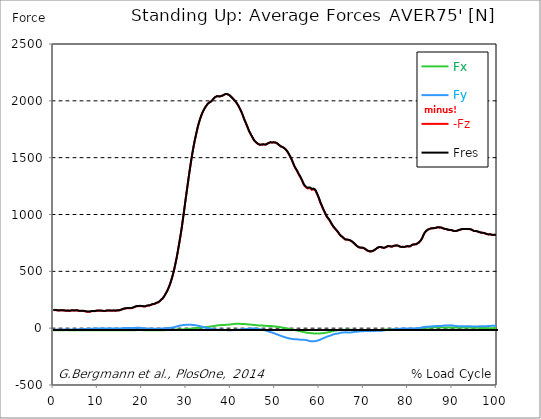
| Category |  Fx |  Fy |  -Fz |  Fres |
|---|---|---|---|---|
| 0.0 | -18.044 | -13.734 | 157.084 | 158.778 |
| 0.167348456675344 | -18.174 | -13.693 | 158.387 | 160.071 |
| 0.334696913350688 | -18.285 | -13.503 | 159.65 | 161.314 |
| 0.5020453700260321 | -18.235 | -13.092 | 159.028 | 160.662 |
| 0.669393826701376 | -18.174 | -12.891 | 158.156 | 159.77 |
| 0.83674228337672 | -18.024 | -12.631 | 157.444 | 159.028 |
| 1.0040907400520642 | -17.813 | -12.761 | 155.66 | 157.244 |
| 1.1621420602454444 | -17.813 | -13.222 | 155.049 | 156.683 |
| 1.3294905169207885 | -17.844 | -13.413 | 155.44 | 157.094 |
| 1.4968389735961325 | -17.864 | -13.473 | 156.011 | 157.665 |
| 1.6641874302714765 | -17.904 | -13.313 | 156.953 | 158.587 |
| 1.8315358869468206 | -17.844 | -12.861 | 157.394 | 158.978 |
| 1.9988843436221646 | -17.673 | -12.45 | 156.973 | 158.507 |
| 2.1662328002975086 | -17.513 | -12.33 | 156.432 | 157.946 |
| 2.333581256972853 | -17.423 | -12.4 | 155.319 | 156.843 |
| 2.5009297136481967 | -17.392 | -12.45 | 155.239 | 156.763 |
| 2.6682781703235405 | -17.232 | -11.889 | 154.457 | 155.921 |
| 2.8356266269988843 | -17.102 | -11.679 | 152.773 | 154.227 |
| 3.002975083674229 | -17.122 | -11.999 | 152.362 | 153.846 |
| 3.1703235403495724 | -17.292 | -12.11 | 153.204 | 154.708 |
| 3.337671997024917 | -17.402 | -11.759 | 153.755 | 155.229 |
| 3.4957233172182973 | -17.352 | -11.378 | 153.004 | 154.457 |
| 3.663071773893641 | -17.262 | -11.478 | 151.971 | 153.435 |
| 3.8304202305689854 | -17.513 | -11.929 | 153.014 | 154.527 |
| 3.997768687244329 | -17.743 | -12.21 | 154.788 | 156.322 |
| 4.165117143919673 | -17.864 | -11.849 | 156.111 | 157.625 |
| 4.332465600595017 | -17.864 | -11.338 | 156.462 | 157.936 |
| 4.499814057270361 | -17.824 | -11.237 | 155.48 | 156.943 |
| 4.667162513945706 | -17.844 | -11.378 | 154.267 | 155.77 |
| 4.834510970621049 | -18.014 | -11.458 | 154.888 | 156.422 |
| 5.001859427296393 | -18.114 | -11.428 | 155.901 | 157.434 |
| 5.169207883971737 | -18.164 | -10.947 | 156.693 | 158.196 |
| 5.336556340647081 | -17.964 | -10.065 | 155.841 | 157.274 |
| 5.503904797322425 | -17.864 | -10.004 | 154.257 | 155.69 |
| 5.671253253997769 | -17.944 | -9.603 | 153.034 | 154.467 |
| 5.82930457419115 | -17.944 | -9.634 | 151.059 | 152.512 |
| 5.996653030866494 | -17.944 | -9.704 | 150.838 | 152.302 |
| 6.164001487541838 | -18.014 | -9.593 | 150.999 | 152.482 |
| 6.331349944217181 | -18.164 | -9.433 | 151.41 | 152.903 |
| 6.498698400892526 | -18.345 | -9.062 | 151.801 | 153.304 |
| 6.66604685756787 | -18.656 | -8.711 | 151.831 | 153.354 |
| 6.833395314243213 | -18.916 | -8.17 | 151.309 | 152.843 |
| 7.000743770918558 | -18.936 | -7.548 | 149.906 | 151.42 |
| 7.168092227593902 | -18.926 | -7.067 | 148.563 | 150.066 |
| 7.335440684269246 | -18.796 | -6.947 | 146.808 | 148.302 |
| 7.50278914094459 | -18.676 | -6.696 | 145.606 | 147.089 |
| 7.6701375976199335 | -18.555 | -6.325 | 144.934 | 146.397 |
| 7.837486054295278 | -18.435 | -5.934 | 144.312 | 145.766 |
| 7.995537374488658 | -18.204 | -5.363 | 144.352 | 145.786 |
| 8.162885831164003 | -18.214 | -4.912 | 144.924 | 146.347 |
| 8.330234287839346 | -18.355 | -4.992 | 146.207 | 147.651 |
| 8.49758274451469 | -18.475 | -4.972 | 148.072 | 149.515 |
| 8.664931201190035 | -18.455 | -4.561 | 149.776 | 151.179 |
| 8.832279657865378 | -18.415 | -4.05 | 150.377 | 151.751 |
| 8.999628114540721 | -18.415 | -3.739 | 150.177 | 151.54 |
| 9.166976571216066 | -18.405 | -3.629 | 149.826 | 151.179 |
| 9.334325027891412 | -18.385 | -3.569 | 149.425 | 150.788 |
| 9.501673484566755 | -18.535 | -3.629 | 150.898 | 152.272 |
| 9.669021941242098 | -18.746 | -3.659 | 152.532 | 153.936 |
| 9.836370397917442 | -18.636 | -2.897 | 153.675 | 155.029 |
| 10.003718854592787 | -18.676 | -2.566 | 153.926 | 155.269 |
| 10.17106731126813 | -18.726 | -2.286 | 154.056 | 155.399 |
| 10.329118631461512 | -18.686 | -2.426 | 153.234 | 154.577 |
| 10.496467088136853 | -18.605 | -2.426 | 153.755 | 155.089 |
| 10.663815544812199 | -18.515 | -2.346 | 154.146 | 155.46 |
| 10.831164001487544 | -18.425 | -2.055 | 153.996 | 155.299 |
| 10.998512458162887 | -18.355 | -1.895 | 152.713 | 154.016 |
| 11.16586091483823 | -18.275 | -1.895 | 151.299 | 152.593 |
| 11.333209371513574 | -18.295 | -2.005 | 150.507 | 151.811 |
| 11.50055782818892 | -18.375 | -2.296 | 150.177 | 151.49 |
| 11.667906284864264 | -18.425 | -2.486 | 150.778 | 152.081 |
| 11.835254741539607 | -18.375 | -2.506 | 152.382 | 153.655 |
| 12.00260319821495 | -18.295 | -2.436 | 153.826 | 155.079 |
| 12.169951654890292 | -18.174 | -2.055 | 154.377 | 155.6 |
| 12.337300111565641 | -18.255 | -2.436 | 154.688 | 155.921 |
| 12.504648568240984 | -18.275 | -2.667 | 155.199 | 156.432 |
| 12.662699888434362 | -18.174 | -2.496 | 155.49 | 156.703 |
| 12.830048345109708 | -18.054 | -2.185 | 154.257 | 155.45 |
| 12.997396801785053 | -18.034 | -2.366 | 153.124 | 154.327 |
| 13.164745258460396 | -18.174 | -2.887 | 152.793 | 154.016 |
| 13.33209371513574 | -18.275 | -2.877 | 153.806 | 155.039 |
| 13.499442171811083 | -18.455 | -2.767 | 155.259 | 156.502 |
| 13.666790628486426 | -18.545 | -2.546 | 155.259 | 156.512 |
| 13.834139085161771 | -18.455 | -2.075 | 154.036 | 155.279 |
| 14.001487541837117 | -18.565 | -2.205 | 152.943 | 154.207 |
| 14.16883599851246 | -18.575 | -2.506 | 153.755 | 155.019 |
| 14.336184455187803 | -18.505 | -2.596 | 155.389 | 156.642 |
| 14.503532911863147 | -18.355 | -2.416 | 155.8 | 157.033 |
| 14.670881368538492 | -18.275 | -2.436 | 155.339 | 156.582 |
| 14.828932688731873 | -18.285 | -2.636 | 155.891 | 157.154 |
| 14.996281145407215 | -18.285 | -2.787 | 157.765 | 159.048 |
| 15.163629602082558 | -18.134 | -2.356 | 160.141 | 161.434 |
| 15.330978058757903 | -17.964 | -1.744 | 162.577 | 163.9 |
| 15.498326515433247 | -17.894 | -1.103 | 165.504 | 166.877 |
| 15.665674972108594 | -17.793 | -0.16 | 167.94 | 169.414 |
| 15.833023428783937 | -17.813 | 0.361 | 169.394 | 170.927 |
| 16.00037188545928 | -17.984 | 0.381 | 171.048 | 172.632 |
| 16.167720342134626 | -18.084 | 0.732 | 172.752 | 174.356 |
| 16.335068798809967 | -18.134 | 1.093 | 173.985 | 175.609 |
| 16.502417255485312 | -18.134 | 1.444 | 174.777 | 176.431 |
| 16.669765712160658 | -18.134 | 1.834 | 175.238 | 176.922 |
| 16.837114168836 | -18.194 | 1.764 | 174.817 | 176.521 |
| 17.004462625511344 | -18.295 | 1.454 | 174.997 | 176.722 |
| 17.16251394570472 | -18.164 | 1.614 | 176.511 | 178.255 |
| 17.32986240238007 | -18.084 | 2.005 | 176.311 | 178.085 |
| 17.497210859055414 | -18.194 | 1.714 | 175.669 | 177.483 |
| 17.664559315730756 | -18.445 | 1.233 | 176.22 | 178.075 |
| 17.8319077724061 | -18.605 | 0.992 | 178.105 | 180.02 |
| 17.999256229081443 | -18.706 | 0.982 | 180.651 | 182.596 |
| 18.166604685756788 | -18.776 | 1.043 | 183.007 | 185.032 |
| 18.333953142432133 | -18.565 | 1.764 | 185.523 | 187.698 |
| 18.501301599107478 | -18.054 | 2.737 | 188.33 | 190.625 |
| 18.668650055782823 | -17.342 | 3.468 | 191.167 | 193.523 |
| 18.835998512458165 | -16.731 | 3.709 | 192.31 | 194.665 |
| 19.00334696913351 | -16.069 | 3.809 | 193.462 | 195.808 |
| 19.170695425808855 | -15.829 | 3.719 | 194.234 | 196.52 |
| 19.338043882484197 | -16.109 | 3.057 | 193.813 | 196.039 |
| 19.496095202677576 | -16.27 | 2.747 | 194.375 | 196.58 |
| 19.66344365935292 | -16.42 | 2.326 | 194.074 | 196.229 |
| 19.830792116028263 | -16.701 | 1.213 | 192.811 | 194.826 |
| 19.998140572703612 | -16.981 | 0.702 | 193.182 | 195.187 |
| 20.165489029378953 | -17.282 | 0.11 | 192.47 | 194.425 |
| 20.3328374860543 | -17.583 | -0.922 | 191.177 | 193.021 |
| 20.500185942729644 | -17.713 | -1.804 | 189.874 | 191.648 |
| 20.667534399404985 | -17.773 | -2.516 | 190.395 | 192.159 |
| 20.83488285608033 | -18.074 | -3.198 | 192.69 | 194.515 |
| 21.002231312755672 | -18.235 | -3.188 | 195.537 | 197.362 |
| 21.16957976943102 | -18.265 | -2.987 | 197.302 | 199.096 |
| 21.336928226106362 | -18.375 | -3.168 | 198.425 | 200.239 |
| 21.504276682781704 | -18.395 | -3.378 | 199.056 | 200.88 |
| 21.67162513945705 | -18.315 | -3.629 | 199.166 | 201.011 |
| 21.82967645965043 | -18.435 | -4.321 | 200.63 | 202.514 |
| 21.997024916325774 | -18.605 | -4.772 | 203.507 | 205.412 |
| 22.16437337300112 | -18.666 | -4.752 | 207.186 | 209.06 |
| 22.33172182967646 | -18.676 | -4.471 | 209.632 | 211.476 |
| 22.499070286351806 | -18.565 | -4.441 | 210.133 | 211.968 |
| 22.666418743027148 | -18.545 | -4.792 | 211.296 | 213.14 |
| 22.833767199702496 | -18.716 | -4.922 | 213.702 | 215.536 |
| 23.00111565637784 | -18.876 | -5.183 | 216.318 | 218.163 |
| 23.168464113053183 | -18.976 | -5.263 | 219.877 | 221.721 |
| 23.335812569728528 | -19.057 | -4.942 | 222.944 | 224.759 |
| 23.50316102640387 | -19.016 | -4.712 | 225.019 | 226.804 |
| 23.670509483079215 | -18.916 | -4.501 | 226.944 | 228.698 |
| 23.83785793975456 | -18.996 | -4.631 | 230.393 | 232.147 |
| 23.995909259947936 | -18.956 | -4.551 | 236.588 | 238.292 |
| 24.163257716623285 | -18.836 | -4.01 | 243.344 | 244.978 |
| 24.330606173298627 | -18.475 | -3.158 | 249.9 | 251.444 |
| 24.49795462997397 | -18.164 | -2.717 | 255.765 | 257.228 |
| 24.665303086649313 | -17.874 | -2.326 | 261.559 | 262.942 |
| 24.83265154332466 | -17.773 | -2.135 | 269.678 | 271.022 |
| 25.0 | -17.553 | -2.045 | 279.573 | 280.866 |
| 25.167348456675345 | -17.312 | -1.564 | 291.061 | 292.294 |
| 25.334696913350694 | -16.971 | -1.012 | 302.799 | 303.922 |
| 25.502045370026035 | -16.52 | -0.07 | 314.097 | 315.119 |
| 25.669393826701377 | -16.18 | 0.852 | 325.364 | 326.307 |
| 25.836742283376722 | -16.26 | 1.444 | 339.519 | 340.411 |
| 26.004090740052067 | -16.38 | 2.075 | 355.007 | 355.859 |
| 26.17143919672741 | -16.58 | 2.356 | 371.477 | 372.289 |
| 26.329490516920792 | -16.691 | 2.406 | 388.769 | 389.531 |
| 26.49683897359613 | -16.41 | 3.118 | 408.818 | 409.55 |
| 26.66418743027148 | -15.969 | 4.361 | 430.05 | 430.752 |
| 26.831535886946828 | -15.408 | 5.333 | 452.555 | 453.257 |
| 26.998884343622166 | -14.676 | 6.827 | 476.654 | 477.346 |
| 27.166232800297514 | -13.894 | 8.33 | 502.317 | 503.018 |
| 27.333581256972852 | -13.282 | 9.623 | 529.914 | 530.616 |
| 27.5009297136482 | -12.641 | 11.488 | 560.068 | 560.799 |
| 27.668278170323543 | -12.12 | 13.503 | 591.063 | 591.855 |
| 27.835626626998888 | -11.668 | 15.227 | 623.342 | 624.154 |
| 28.002975083674233 | -11.338 | 16.871 | 658.237 | 659.069 |
| 28.170323540349575 | -11.217 | 18.746 | 694.847 | 695.719 |
| 28.33767199702492 | -11.117 | 20.42 | 733.421 | 734.313 |
| 28.50502045370026 | -11.097 | 21.964 | 772.165 | 773.078 |
| 28.663071773893645 | -11.288 | 23.397 | 810.319 | 811.241 |
| 28.830420230568986 | -11.658 | 24.44 | 850.597 | 851.499 |
| 28.99776868724433 | -11.769 | 25.482 | 893.782 | 894.675 |
| 29.165117143919673 | -11.077 | 26.725 | 940.747 | 941.629 |
| 29.33246560059502 | -10.696 | 27.467 | 988.474 | 989.316 |
| 29.499814057270367 | -10.385 | 28.219 | 1035.318 | 1036.14 |
| 29.66716251394571 | -9.804 | 28.82 | 1083.456 | 1084.257 |
| 29.834510970621054 | -9.202 | 29.502 | 1133.247 | 1134.029 |
| 30.00185942729639 | -8.882 | 29.913 | 1178.668 | 1179.43 |
| 30.169207883971744 | -8.1 | 30.274 | 1224.991 | 1225.733 |
| 30.33655634064708 | -7.137 | 30.535 | 1271.956 | 1272.668 |
| 30.50390479732243 | -6.335 | 30.525 | 1318.78 | 1319.462 |
| 30.671253253997772 | -5.674 | 30.414 | 1364.642 | 1365.294 |
| 30.829304574191156 | -5.112 | 29.933 | 1408.64 | 1409.251 |
| 30.996653030866494 | -4.591 | 29.271 | 1452.015 | 1452.607 |
| 31.164001487541842 | -4 | 28.941 | 1492.975 | 1493.557 |
| 31.331349944217187 | -3.258 | 28.63 | 1531.961 | 1532.522 |
| 31.498698400892525 | -2.406 | 27.988 | 1569.813 | 1570.374 |
| 31.666046857567874 | -1.494 | 27.206 | 1605.671 | 1606.222 |
| 31.833395314243212 | -0.622 | 26.595 | 1638.681 | 1639.223 |
| 32.00074377091856 | 0.19 | 26.164 | 1669.647 | 1670.188 |
| 32.1680922275939 | 0.952 | 25.522 | 1699.279 | 1699.81 |
| 32.33544068426925 | 1.664 | 23.868 | 1728.711 | 1729.222 |
| 32.50278914094459 | 2.366 | 22.294 | 1756.709 | 1757.211 |
| 32.670137597619934 | 3.067 | 21.001 | 1782.623 | 1783.104 |
| 32.83748605429528 | 3.789 | 19.708 | 1806.431 | 1806.902 |
| 33.004834510970625 | 4.561 | 18.505 | 1827.943 | 1828.394 |
| 33.162885831164004 | 5.213 | 17.002 | 1847.832 | 1848.283 |
| 33.33023428783935 | 5.694 | 15.127 | 1866.367 | 1866.798 |
| 33.497582744514695 | 6.245 | 13.272 | 1883.549 | 1883.95 |
| 33.664931201190036 | 7.087 | 11.548 | 1898.927 | 1899.318 |
| 33.83227965786538 | 7.809 | 9.804 | 1912.811 | 1913.181 |
| 33.99962811454073 | 8.32 | 8.04 | 1925.111 | 1925.461 |
| 34.16697657121607 | 8.952 | 6.566 | 1936.047 | 1936.378 |
| 34.33432502789141 | 9.433 | 4.852 | 1946.563 | 1946.884 |
| 34.50167348456676 | 10.245 | 3.398 | 1955.826 | 1956.146 |
| 34.6690219412421 | 11.147 | 1.865 | 1965.158 | 1965.479 |
| 34.83637039791744 | 12.039 | 0.331 | 1974.491 | 1974.802 |
| 35.00371885459279 | 12.721 | -1.193 | 1980.987 | 1981.298 |
| 35.17106731126814 | 13.433 | -2.225 | 1984.776 | 1985.087 |
| 35.338415767943474 | 13.724 | -2.877 | 1986.42 | 1986.721 |
| 35.49646708813686 | 14.295 | -4.27 | 1991.824 | 1992.104 |
| 35.6638155448122 | 15.137 | -5.544 | 1998.129 | 1998.4 |
| 35.831164001487544 | 16.23 | -6.626 | 2005.176 | 2005.447 |
| 35.998512458162885 | 17.062 | -8.01 | 2012.434 | 2012.704 |
| 36.165860914838234 | 18.144 | -9.553 | 2019.922 | 2020.193 |
| 36.333209371513576 | 19.628 | -10.536 | 2026.488 | 2026.759 |
| 36.50055782818892 | 20.871 | -11.699 | 2032.052 | 2032.342 |
| 36.667906284864266 | 21.813 | -12.711 | 2036.162 | 2036.473 |
| 36.83525474153961 | 22.956 | -13.543 | 2039.42 | 2039.741 |
| 37.002603198214956 | 23.989 | -14.114 | 2041.014 | 2041.354 |
| 37.1699516548903 | 24.921 | -13.904 | 2040.563 | 2040.913 |
| 37.337300111565646 | 25.582 | -13.693 | 2039.269 | 2039.63 |
| 37.50464856824098 | 25.853 | -13.713 | 2038.387 | 2038.748 |
| 37.66269988843437 | 26.735 | -13.533 | 2039.991 | 2040.372 |
| 37.83004834510971 | 27.216 | -13.633 | 2041.806 | 2042.197 |
| 37.99739680178505 | 27.798 | -13.734 | 2043.59 | 2043.991 |
| 38.16474525846039 | 28.439 | -13.673 | 2045.916 | 2046.317 |
| 38.33209371513574 | 28.53 | -13.974 | 2049.745 | 2050.146 |
| 38.49944217181109 | 28.52 | -14.766 | 2053.805 | 2054.206 |
| 38.666790628486424 | 28.51 | -15.769 | 2057.444 | 2057.845 |
| 38.83413908516178 | 28.881 | -16.37 | 2059.038 | 2059.439 |
| 39.001487541837115 | 30.013 | -16.39 | 2059.589 | 2060.01 |
| 39.16883599851246 | 30.414 | -17.002 | 2059.328 | 2059.749 |
| 39.336184455187805 | 30.775 | -17.763 | 2057.564 | 2057.995 |
| 39.503532911863154 | 31.437 | -18.004 | 2054.446 | 2054.877 |
| 39.670881368538495 | 31.788 | -18.315 | 2050.407 | 2050.838 |
| 39.83822982521384 | 32.169 | -18.636 | 2045.705 | 2046.146 |
| 39.996281145407224 | 33.131 | -18.465 | 2039.48 | 2039.931 |
| 40.163629602082565 | 33.983 | -18.315 | 2033.195 | 2033.656 |
| 40.33097805875791 | 34.685 | -18.064 | 2026.689 | 2027.16 |
| 40.498326515433256 | 35.998 | -17.012 | 2019.631 | 2020.133 |
| 40.6656749721086 | 36.89 | -16.099 | 2012.664 | 2013.176 |
| 40.83302342878393 | 37.512 | -15.448 | 2005.788 | 2006.309 |
| 41.00037188545929 | 37.993 | -14.936 | 1998.961 | 1999.492 |
| 41.16772034213463 | 38.213 | -14.185 | 1990.941 | 1991.493 |
| 41.33506879880997 | 38.324 | -14.084 | 1981.418 | 1981.979 |
| 41.50241725548531 | 38.163 | -14.215 | 1971.384 | 1971.945 |
| 41.66976571216066 | 38.263 | -13.282 | 1961.159 | 1961.73 |
| 41.837114168836 | 38.213 | -12.691 | 1949.57 | 1950.152 |
| 42.004462625511344 | 38.193 | -11.959 | 1936.789 | 1937.371 |
| 42.17181108218669 | 37.893 | -11.739 | 1924.018 | 1924.619 |
| 42.32986240238007 | 37.592 | -11.298 | 1910.455 | 1911.066 |
| 42.497210859055414 | 37.391 | -10.556 | 1895.548 | 1896.17 |
| 42.66455931573076 | 37.261 | -9.253 | 1879.188 | 1879.81 |
| 42.831907772406105 | 37.071 | -7.839 | 1861.205 | 1861.826 |
| 42.999256229081446 | 36.81 | -6.746 | 1843.501 | 1844.123 |
| 43.16660468575679 | 36.309 | -6.626 | 1828.134 | 1828.785 |
| 43.33395314243214 | 35.597 | -6.947 | 1813.017 | 1813.679 |
| 43.50130159910748 | 34.755 | -7.538 | 1797.329 | 1798.01 |
| 43.66865005578282 | 34.093 | -7.178 | 1781.63 | 1782.322 |
| 43.83599851245817 | 33.331 | -6.797 | 1765.872 | 1766.553 |
| 44.00334696913351 | 32.87 | -6.245 | 1748.088 | 1748.76 |
| 44.17069542580886 | 32.369 | -5.483 | 1733.002 | 1733.683 |
| 44.3380438824842 | 31.878 | -4.601 | 1720.14 | 1720.812 |
| 44.49609520267758 | 31.397 | -4.2 | 1708.101 | 1708.792 |
| 44.66344365935292 | 30.946 | -3.529 | 1695.951 | 1696.633 |
| 44.83079211602827 | 30.364 | -2.656 | 1684.062 | 1684.754 |
| 44.99814057270361 | 29.582 | -2.256 | 1672.323 | 1672.995 |
| 45.16548902937895 | 28.68 | -2.286 | 1660.013 | 1660.675 |
| 45.332837486054295 | 27.958 | -2.967 | 1650.58 | 1651.252 |
| 45.500185942729644 | 27.397 | -3.448 | 1644.375 | 1645.037 |
| 45.66753439940499 | 26.705 | -4.391 | 1637.468 | 1638.12 |
| 45.83488285608033 | 26.014 | -5.353 | 1630.752 | 1631.393 |
| 46.00223131275568 | 25.362 | -6.506 | 1625.669 | 1626.311 |
| 46.16957976943102 | 24.66 | -7.568 | 1620.036 | 1620.677 |
| 46.336928226106366 | 24.259 | -8.501 | 1617.159 | 1617.81 |
| 46.50427668278171 | 23.898 | -9.263 | 1614.863 | 1615.515 |
| 46.671625139457056 | 23.527 | -10.125 | 1613.089 | 1613.74 |
| 46.829676459650436 | 23.397 | -11.047 | 1613.77 | 1614.422 |
| 46.99702491632577 | 23.217 | -12.13 | 1615.114 | 1615.755 |
| 47.16437337300112 | 22.946 | -13.443 | 1616.808 | 1617.449 |
| 47.33172182967646 | 22.485 | -14.916 | 1617.129 | 1617.76 |
| 47.49907028635181 | 22.004 | -16.41 | 1616.617 | 1617.259 |
| 47.66641874302716 | 21.292 | -17.984 | 1614.743 | 1615.394 |
| 47.83376719970249 | 20.52 | -19.728 | 1613.51 | 1614.161 |
| 48.001115656377834 | 20.179 | -21.833 | 1616.277 | 1616.938 |
| 48.16846411305319 | 20.099 | -24.089 | 1620.356 | 1621.038 |
| 48.33581256972853 | 19.969 | -26.334 | 1624.236 | 1624.928 |
| 48.50316102640387 | 19.768 | -28.58 | 1627.765 | 1628.486 |
| 48.67050948307921 | 19.498 | -30.625 | 1630.632 | 1631.373 |
| 48.837857939754564 | 19.157 | -32.469 | 1632.837 | 1633.589 |
| 49.005206396429905 | 18.836 | -34.364 | 1634.862 | 1635.614 |
| 49.163257716623285 | 18.505 | -36.439 | 1635.062 | 1635.844 |
| 49.33060617329863 | 17.844 | -38.404 | 1633.017 | 1633.819 |
| 49.49795462997397 | 17.212 | -40.679 | 1633.689 | 1634.521 |
| 49.66530308664932 | 16.51 | -42.945 | 1634.581 | 1635.433 |
| 49.832651543324666 | 15.648 | -45.611 | 1633.92 | 1634.802 |
| 50.0 | 14.766 | -48.358 | 1632.997 | 1633.93 |
| 50.16734845667534 | 14.054 | -50.894 | 1631.674 | 1632.657 |
| 50.33469691335069 | 13.493 | -53.21 | 1629.118 | 1630.16 |
| 50.50204537002604 | 12.741 | -55.175 | 1623.645 | 1624.747 |
| 50.66939382670139 | 11.859 | -57.51 | 1618.562 | 1619.725 |
| 50.836742283376715 | 10.887 | -59.936 | 1613.379 | 1614.612 |
| 51.00409074005207 | 9.694 | -62.623 | 1607.936 | 1609.259 |
| 51.17143919672741 | 8.441 | -65.149 | 1602.854 | 1604.267 |
| 51.32949051692079 | 7.178 | -67.555 | 1598.263 | 1599.766 |
| 51.496838973596134 | 6.115 | -69.991 | 1596.428 | 1598.032 |
| 51.66418743027148 | 5.213 | -72.266 | 1592.93 | 1594.644 |
| 51.831535886946824 | 4.19 | -74.472 | 1588.84 | 1590.674 |
| 51.99888434362217 | 3.408 | -76.777 | 1584.84 | 1586.774 |
| 52.16623280029752 | 2.506 | -79.013 | 1579.797 | 1581.852 |
| 52.33358125697285 | 1.373 | -81.178 | 1574.144 | 1576.319 |
| 52.5009297136482 | 0.08 | -83.053 | 1566.946 | 1569.242 |
| 52.668278170323546 | -1.203 | -84.737 | 1559.077 | 1561.483 |
| 52.835626626998895 | -2.406 | -86.211 | 1550.085 | 1552.581 |
| 53.00297508367424 | -3.719 | -87.744 | 1538.988 | 1541.594 |
| 53.17032354034958 | -4.972 | -89.258 | 1527.4 | 1530.126 |
| 53.33767199702492 | -6.155 | -90.792 | 1515.811 | 1518.658 |
| 53.50502045370027 | -7.398 | -92.255 | 1503.411 | 1506.368 |
| 53.663071773893655 | -8.711 | -93.578 | 1489.707 | 1492.765 |
| 53.83042023056899 | -10.195 | -94.791 | 1474.851 | 1478.029 |
| 53.99776868724433 | -11.779 | -95.754 | 1459.414 | 1462.712 |
| 54.16511714391967 | -13.413 | -96.395 | 1443.234 | 1446.622 |
| 54.33246560059503 | -15.167 | -96.706 | 1426.734 | 1430.192 |
| 54.49981405727037 | -16.781 | -97.237 | 1413.321 | 1416.86 |
| 54.667162513945705 | -18.375 | -98.009 | 1402.575 | 1406.214 |
| 54.834510970621054 | -19.798 | -98.21 | 1392.26 | 1395.949 |
| 55.0018594272964 | -21.382 | -98.33 | 1381.313 | 1385.082 |
| 55.169207883971744 | -22.896 | -98.761 | 1367.479 | 1371.348 |
| 55.336556340647086 | -24.319 | -99.383 | 1353.745 | 1357.725 |
| 55.50390479732243 | -25.793 | -100.425 | 1343.099 | 1347.2 |
| 55.671253253997776 | -27.267 | -101.267 | 1331.852 | 1336.062 |
| 55.83860171067312 | -28.77 | -101.287 | 1318.219 | 1322.499 |
| 55.9966530308665 | -30.254 | -102.029 | 1306.42 | 1310.831 |
| 56.16400148754184 | -31.878 | -102.781 | 1292.356 | 1296.897 |
| 56.33134994421718 | -33.311 | -102.931 | 1277.118 | 1281.76 |
| 56.498698400892536 | -34.494 | -102.951 | 1262.954 | 1267.665 |
| 56.66604685756788 | -35.707 | -103.032 | 1252.328 | 1257.12 |
| 56.83339531424321 | -37 | -103.573 | 1244.749 | 1249.661 |
| 57.00074377091856 | -38.414 | -104.956 | 1238.825 | 1243.927 |
| 57.16809222759391 | -39.677 | -106.28 | 1233.281 | 1238.584 |
| 57.33544068426925 | -40.569 | -107.683 | 1229.332 | 1234.845 |
| 57.5027891409446 | -41.301 | -109.618 | 1229.201 | 1234.965 |
| 57.670137597619934 | -41.952 | -111.803 | 1232.169 | 1238.193 |
| 57.83748605429528 | -42.634 | -113.728 | 1234.705 | 1240.96 |
| 58.004834510970625 | -43.446 | -114.259 | 1229.602 | 1235.988 |
| 58.16288583116401 | -44.128 | -115.011 | 1225.603 | 1232.149 |
| 58.330234287839346 | -44.609 | -114.379 | 1217.292 | 1223.868 |
| 58.497582744514695 | -45.291 | -114.961 | 1222.134 | 1228.78 |
| 58.66493120119004 | -46.123 | -115.472 | 1221.493 | 1228.209 |
| 58.832279657865385 | -46.654 | -115.703 | 1220.811 | 1227.577 |
| 58.999628114540734 | -46.534 | -114.891 | 1214.846 | 1221.563 |
| 59.16697657121607 | -46.363 | -113.658 | 1205.925 | 1212.561 |
| 59.33432502789142 | -46.544 | -112.154 | 1192.482 | 1199.028 |
| 59.50167348456676 | -46.654 | -110.49 | 1177.866 | 1184.332 |
| 59.66902194124211 | -46.895 | -108.645 | 1162.739 | 1169.115 |
| 59.83637039791745 | -47.285 | -107.061 | 1147.291 | 1153.597 |
| 60.00371885459278 | -46.874 | -104.385 | 1129.608 | 1135.713 |
| 60.17106731126813 | -45.912 | -100.906 | 1110.091 | 1115.875 |
| 60.33841576794349 | -45.682 | -98.11 | 1093.951 | 1099.515 |
| 60.49646708813685 | -45.311 | -95.513 | 1079.827 | 1085.2 |
| 60.6638155448122 | -44.639 | -92.696 | 1064.249 | 1069.401 |
| 60.831164001487544 | -43.807 | -89.839 | 1048.871 | 1053.803 |
| 60.99851245816289 | -43.286 | -87.293 | 1035.218 | 1039.969 |
| 61.16586091483824 | -42.624 | -84.617 | 1022.056 | 1026.597 |
| 61.333209371513576 | -41.461 | -81.539 | 1008.322 | 1012.613 |
| 61.50055782818892 | -40.138 | -78.411 | 994.699 | 998.739 |
| 61.667906284864266 | -38.795 | -75.444 | 981.527 | 985.336 |
| 61.835254741539615 | -37.311 | -73.219 | 971.602 | 975.221 |
| 62.002603198214956 | -35.737 | -71.575 | 964.224 | 967.693 |
| 62.16995165489029 | -34.153 | -69.841 | 956.415 | 959.733 |
| 62.33730011156564 | -32.529 | -67.615 | 946.12 | 949.258 |
| 62.504648568240995 | -30.966 | -65.47 | 935.073 | 938.05 |
| 62.67199702491633 | -29.412 | -62.603 | 923.435 | 926.212 |
| 62.83004834510971 | -27.898 | -59.776 | 912.779 | 915.345 |
| 62.99739680178505 | -26.234 | -57.099 | 902.664 | 905.05 |
| 63.1647452584604 | -24.7 | -54.373 | 892.65 | 894.845 |
| 63.33209371513575 | -23.357 | -52.478 | 884.109 | 886.184 |
| 63.4994421718111 | -22.214 | -51.145 | 876.871 | 878.866 |
| 63.666790628486424 | -21.091 | -49.832 | 869.613 | 871.528 |
| 63.83413908516177 | -20.149 | -48.939 | 862.045 | 863.909 |
| 64.00148754183712 | -19.207 | -48.047 | 854.476 | 856.301 |
| 64.16883599851248 | -18.395 | -47.366 | 846.697 | 848.492 |
| 64.3361844551878 | -17.593 | -46.062 | 837.415 | 839.129 |
| 64.50353291186315 | -16.981 | -44.118 | 828.072 | 829.696 |
| 64.6708813685385 | -16.45 | -42.253 | 819.501 | 821.055 |
| 64.83822982521384 | -15.718 | -40.208 | 812.293 | 813.747 |
| 65.00557828188919 | -15.137 | -38.905 | 806.409 | 807.792 |
| 65.16362960208257 | -14.295 | -39.176 | 802.991 | 804.394 |
| 65.3309780587579 | -14.074 | -38.825 | 797.788 | 799.191 |
| 65.49832651543326 | -14.285 | -38.344 | 791.573 | 792.996 |
| 65.6656749721086 | -14.155 | -37.101 | 785.478 | 786.881 |
| 65.83302342878395 | -14.084 | -35.888 | 780.426 | 781.769 |
| 66.00037188545929 | -13.393 | -35.777 | 778.401 | 779.754 |
| 66.16772034213463 | -13.272 | -37.221 | 778.842 | 780.295 |
| 66.33506879880998 | -13.683 | -38.294 | 778.531 | 780.085 |
| 66.50241725548531 | -14.155 | -38.815 | 776.897 | 778.541 |
| 66.66976571216065 | -13.944 | -38.083 | 773.719 | 775.343 |
| 66.83711416883601 | -14.235 | -38.344 | 773.188 | 774.852 |
| 67.00446262551135 | -14.415 | -38.113 | 771.123 | 772.787 |
| 67.1718110821867 | -14.716 | -37.461 | 767.534 | 769.188 |
| 67.32986240238007 | -15.117 | -36.449 | 762.783 | 764.396 |
| 67.49721085905541 | -15.388 | -35.266 | 757.82 | 759.384 |
| 67.66455931573076 | -15.498 | -34.173 | 752.558 | 754.081 |
| 67.83190777240611 | -15.438 | -33.131 | 746.463 | 747.956 |
| 67.99925622908145 | -15.398 | -32.409 | 739.836 | 741.3 |
| 68.16660468575678 | -15.558 | -31.888 | 733.401 | 734.854 |
| 68.33395314243214 | -15.849 | -31.457 | 727.105 | 728.549 |
| 68.50130159910749 | -16.039 | -30.895 | 721.502 | 722.925 |
| 68.66865005578282 | -16.2 | -30.244 | 716.54 | 717.923 |
| 68.83599851245816 | -16.25 | -29.522 | 712.58 | 713.923 |
| 69.00334696913352 | -16.26 | -28.63 | 709.883 | 711.187 |
| 69.17069542580886 | -16.19 | -27.617 | 708.52 | 709.763 |
| 69.3380438824842 | -16.149 | -26.635 | 707.728 | 708.921 |
| 69.50539233915956 | -15.829 | -26.124 | 707.437 | 708.58 |
| 69.66344365935292 | -15.638 | -26.144 | 707.097 | 708.239 |
| 69.83079211602826 | -15.448 | -26.164 | 706.766 | 707.899 |
| 69.99814057270362 | -15.498 | -26.104 | 704.38 | 705.493 |
| 70.16548902937896 | -15.779 | -25.723 | 701.052 | 702.134 |
| 70.33283748605429 | -16.119 | -25.693 | 696.591 | 697.664 |
| 70.50018594272964 | -16.55 | -25.733 | 691.98 | 693.042 |
| 70.667534399405 | -17.062 | -25.592 | 687.007 | 688.08 |
| 70.83488285608033 | -17.613 | -25.863 | 682.577 | 683.659 |
| 71.00223131275568 | -17.964 | -25.673 | 679.92 | 680.993 |
| 71.16957976943102 | -18.295 | -25.853 | 677.384 | 678.467 |
| 71.33692822610637 | -18.545 | -26.124 | 675.118 | 676.221 |
| 71.50427668278171 | -18.595 | -25.963 | 674.357 | 675.469 |
| 71.67162513945706 | -18.676 | -25.943 | 674.577 | 675.69 |
| 71.8389735961324 | -18.686 | -25.683 | 675.991 | 677.093 |
| 71.99702491632577 | -18.756 | -25.202 | 677.805 | 678.878 |
| 72.16437337300113 | -18.605 | -24.781 | 680.953 | 682.005 |
| 72.33172182967647 | -18.375 | -24.5 | 684.401 | 685.434 |
| 72.49907028635181 | -18.154 | -24.189 | 688.792 | 689.784 |
| 72.66641874302715 | -17.884 | -24.029 | 693.233 | 694.215 |
| 72.8337671997025 | -17.352 | -23.768 | 698.255 | 699.187 |
| 73.00111565637783 | -16.661 | -23.307 | 703.708 | 704.6 |
| 73.16846411305319 | -16.049 | -22.896 | 707.698 | 708.54 |
| 73.33581256972853 | -15.518 | -22.786 | 711.247 | 712.059 |
| 73.50316102640387 | -15.247 | -23.227 | 713.362 | 714.164 |
| 73.67050948307921 | -15.087 | -23.086 | 713.713 | 714.505 |
| 73.83785793975457 | -15.047 | -22.966 | 713.021 | 713.793 |
| 74.00520639642991 | -15.027 | -22.595 | 711.527 | 712.299 |
| 74.16325771662328 | -14.997 | -21.703 | 709.623 | 710.375 |
| 74.33060617329863 | -14.916 | -20.721 | 707.798 | 708.53 |
| 74.49795462997398 | -14.576 | -19.618 | 706.686 | 707.387 |
| 74.66530308664932 | -14.185 | -18.796 | 707.066 | 707.728 |
| 74.83265154332466 | -13.333 | -18.054 | 708.741 | 709.392 |
| 75.00000000000001 | -12.49 | -17.382 | 712.039 | 712.67 |
| 75.16734845667534 | -11.699 | -16.771 | 715.878 | 716.5 |
| 75.3346969133507 | -11.237 | -15.728 | 719.667 | 720.279 |
| 75.50204537002605 | -11.127 | -14.676 | 721.762 | 722.384 |
| 75.66939382670138 | -11.197 | -14.074 | 722.304 | 722.915 |
| 75.83674228337672 | -11.137 | -14.024 | 721.191 | 721.792 |
| 76.00409074005208 | -11.468 | -13.513 | 718.615 | 719.196 |
| 76.17143919672742 | -11.739 | -13.092 | 717.231 | 717.803 |
| 76.33878765340276 | -11.578 | -12.12 | 717.672 | 718.254 |
| 76.49683897359614 | -11.227 | -11.137 | 718.795 | 719.356 |
| 76.66418743027148 | -10.616 | -10.315 | 721.191 | 721.742 |
| 76.83153588694682 | -10.004 | -9.503 | 724.218 | 724.79 |
| 76.99888434362218 | -9.423 | -8.721 | 726.865 | 727.446 |
| 77.16623280029752 | -9.443 | -8.401 | 726.213 | 726.795 |
| 77.33358125697285 | -9.483 | -8.15 | 726.233 | 726.815 |
| 77.5009297136482 | -9.142 | -7.709 | 727.276 | 727.857 |
| 77.66827817032356 | -8.852 | -7.238 | 727.396 | 727.978 |
| 77.83562662699889 | -9.022 | -6.756 | 725.06 | 725.652 |
| 78.00297508367423 | -9.293 | -6.125 | 721.422 | 722.013 |
| 78.17032354034959 | -9.443 | -5.584 | 717.532 | 718.123 |
| 78.33767199702493 | -9.513 | -5.002 | 714.966 | 715.557 |
| 78.50502045370027 | -9.413 | -4.27 | 714.394 | 714.986 |
| 78.67236891037561 | -8.852 | -3.739 | 715.096 | 715.688 |
| 78.83042023056899 | -8.601 | -3.529 | 715.236 | 715.818 |
| 78.99776868724433 | -8.922 | -3.268 | 713.913 | 714.505 |
| 79.16511714391969 | -9.012 | -2.907 | 713.382 | 713.963 |
| 79.33246560059503 | -8.691 | -2.466 | 714.886 | 715.447 |
| 79.49981405727036 | -8.22 | -2.145 | 717.722 | 718.264 |
| 79.66716251394571 | -7.759 | -2.045 | 720.249 | 720.79 |
| 79.83451097062107 | -7.719 | -2.476 | 721.291 | 721.833 |
| 80.00185942729641 | -7.969 | -2.646 | 720.74 | 721.281 |
| 80.16920788397174 | -8.23 | -2.646 | 718.865 | 719.397 |
| 80.33655634064709 | -8.35 | -2.506 | 718.234 | 718.745 |
| 80.50390479732243 | -8.12 | -2.235 | 720.409 | 720.91 |
| 80.67125325399778 | -7.558 | -2.276 | 724.168 | 724.679 |
| 80.83860171067312 | -6.777 | -2.195 | 729.401 | 729.922 |
| 80.99665303086651 | -6.145 | -2.165 | 733.802 | 734.333 |
| 81.16400148754184 | -5.965 | -2.296 | 735.797 | 736.318 |
| 81.3313499442172 | -5.884 | -2.045 | 737.521 | 738.032 |
| 81.49869840089255 | -6.155 | -1.945 | 736.869 | 737.37 |
| 81.66604685756786 | -6.426 | -1.834 | 736.158 | 736.669 |
| 81.83339531424322 | -6.145 | -1.444 | 738.393 | 738.894 |
| 82.00074377091858 | -5.584 | -1.063 | 742.353 | 742.854 |
| 82.16809222759392 | -5.123 | -0.912 | 746.262 | 746.763 |
| 82.33544068426926 | -4.752 | -0.912 | 750.001 | 750.493 |
| 82.50278914094459 | -4.401 | -0.15 | 754.913 | 755.374 |
| 82.67013759761994 | -4.03 | 1.363 | 761.269 | 761.69 |
| 82.83748605429528 | -3.458 | 3.067 | 769.038 | 769.429 |
| 83.00483451097062 | -2.546 | 5.243 | 779.012 | 779.373 |
| 83.17218296764597 | -1.564 | 6.787 | 789.097 | 789.448 |
| 83.33023428783935 | 0.04 | 8.12 | 804.244 | 804.605 |
| 83.4975827445147 | 1.564 | 9.323 | 819.13 | 819.511 |
| 83.66493120119004 | 2.737 | 10.185 | 832.703 | 833.094 |
| 83.83227965786537 | 3.348 | 10.686 | 843.139 | 843.53 |
| 83.99962811454073 | 4.1 | 11.679 | 850.928 | 851.329 |
| 84.16697657121607 | 4.571 | 12.32 | 857.373 | 857.774 |
| 84.33432502789142 | 4.381 | 12.651 | 861.975 | 862.376 |
| 84.50167348456677 | 4.29 | 12.791 | 866.897 | 867.308 |
| 84.6690219412421 | 4.421 | 12.912 | 870.656 | 871.067 |
| 84.83637039791745 | 4.481 | 13.082 | 872.23 | 872.651 |
| 85.0037188545928 | 4.862 | 13.924 | 874.225 | 874.676 |
| 85.17106731126813 | 5.433 | 15.097 | 876.921 | 877.412 |
| 85.33841576794349 | 5.804 | 15.698 | 878.826 | 879.347 |
| 85.50576422461883 | 6.215 | 15.959 | 879.147 | 879.698 |
| 85.66381554481221 | 6.556 | 16.54 | 878.956 | 879.528 |
| 85.83116400148755 | 7.027 | 16.891 | 879.588 | 880.189 |
| 85.99851245816289 | 7.679 | 17.523 | 880.751 | 881.402 |
| 86.16586091483823 | 7.909 | 18.044 | 880.921 | 881.603 |
| 86.33320937151358 | 8.05 | 18.285 | 882.996 | 883.688 |
| 86.50055782818893 | 8.27 | 18.525 | 885.552 | 886.264 |
| 86.66790628486427 | 8.37 | 18.646 | 887.036 | 887.758 |
| 86.83525474153961 | 8.19 | 18.656 | 887.256 | 887.978 |
| 87.00260319821496 | 7.779 | 18.615 | 886.705 | 887.427 |
| 87.16995165489031 | 7.288 | 18.926 | 885.622 | 886.354 |
| 87.33730011156564 | 6.957 | 19.187 | 884.871 | 885.602 |
| 87.504648568241 | 7.007 | 19.297 | 884.861 | 885.592 |
| 87.67199702491634 | 6.977 | 19.969 | 882.685 | 883.417 |
| 87.83004834510972 | 6.907 | 20.911 | 879.508 | 880.239 |
| 87.99739680178506 | 6.787 | 21.843 | 876.6 | 877.332 |
| 88.1647452584604 | 6.857 | 23.026 | 874.275 | 875.027 |
| 88.33209371513574 | 6.947 | 23.768 | 872.901 | 873.663 |
| 88.49944217181108 | 6.967 | 23.918 | 872.23 | 872.982 |
| 88.66679062848644 | 6.957 | 24.38 | 870.726 | 871.478 |
| 88.83413908516178 | 6.897 | 24.851 | 868.721 | 869.493 |
| 89.00148754183712 | 6.566 | 24.169 | 865.944 | 866.666 |
| 89.16883599851246 | 6.516 | 24.209 | 864.501 | 865.213 |
| 89.33618445518782 | 6.626 | 24.38 | 863.478 | 864.2 |
| 89.50353291186315 | 6.947 | 24.791 | 863.579 | 864.31 |
| 89.6708813685385 | 7.067 | 24.901 | 863.077 | 863.819 |
| 89.83822982521386 | 7.047 | 24.74 | 862.506 | 863.238 |
| 90.00557828188919 | 6.787 | 23.969 | 861.153 | 861.844 |
| 90.16362960208257 | 5.884 | 21.693 | 856.622 | 857.223 |
| 90.3309780587579 | 5.523 | 20.43 | 854.707 | 855.268 |
| 90.49832651543326 | 5.624 | 20.019 | 854.928 | 855.469 |
| 90.66567497210859 | 5.754 | 20.049 | 854.336 | 854.887 |
| 90.83302342878395 | 5.784 | 18.976 | 854.476 | 855.018 |
| 91.00037188545929 | 5.734 | 18.134 | 855.659 | 856.181 |
| 91.16772034213463 | 5.754 | 17.834 | 858.195 | 858.727 |
| 91.33506879880998 | 5.914 | 17.282 | 861.724 | 862.255 |
| 91.50241725548533 | 5.914 | 17.022 | 863.478 | 864.01 |
| 91.66976571216065 | 5.714 | 16.981 | 865.152 | 865.684 |
| 91.83711416883601 | 5.774 | 17.122 | 866.987 | 867.518 |
| 92.00446262551137 | 5.884 | 17.242 | 868.972 | 869.513 |
| 92.1718110821867 | 5.965 | 17.342 | 871.037 | 871.578 |
| 92.33915953886203 | 6.025 | 17.513 | 871.759 | 872.32 |
| 92.49721085905541 | 6.075 | 17.683 | 872.3 | 872.881 |
| 92.66455931573077 | 6.115 | 17.914 | 872.37 | 872.972 |
| 92.83190777240611 | 5.874 | 17.874 | 872.45 | 873.052 |
| 92.99925622908145 | 5.604 | 17.713 | 872.42 | 873.022 |
| 93.1666046857568 | 5.483 | 17.362 | 871.989 | 872.581 |
| 93.33395314243214 | 5.413 | 17.192 | 872.049 | 872.621 |
| 93.50130159910749 | 5.373 | 17.102 | 872.39 | 872.952 |
| 93.66865005578283 | 5.253 | 16.741 | 872.721 | 873.272 |
| 93.83599851245818 | 5.153 | 16.47 | 872.19 | 872.731 |
| 94.00334696913353 | 4.872 | 16.129 | 870.586 | 871.127 |
| 94.17069542580886 | 4.511 | 15.738 | 868.992 | 869.543 |
| 94.3380438824842 | 4.521 | 15.698 | 867.508 | 868.05 |
| 94.50539233915954 | 4.19 | 15.478 | 863.859 | 864.391 |
| 94.66344365935292 | 3.599 | 15.087 | 858.947 | 859.469 |
| 94.83079211602828 | 3.057 | 14.886 | 855.208 | 855.719 |
| 94.99814057270362 | 2.677 | 14.977 | 853.815 | 854.326 |
| 95.16548902937897 | 2.646 | 15.167 | 854.075 | 854.567 |
| 95.33283748605432 | 2.677 | 15.207 | 853.725 | 854.206 |
| 95.50018594272963 | 2.877 | 15.267 | 853.173 | 853.644 |
| 95.66753439940499 | 3.057 | 15.568 | 851.97 | 852.431 |
| 95.83488285608034 | 2.757 | 15.688 | 848.783 | 849.244 |
| 96.00223131275567 | 2.105 | 15.809 | 845.464 | 845.926 |
| 96.16957976943102 | 2.005 | 15.979 | 843.951 | 844.402 |
| 96.33692822610638 | 1.704 | 16.21 | 842.216 | 842.668 |
| 96.50427668278171 | 1.373 | 16.651 | 840.212 | 840.663 |
| 96.67162513945706 | 1.293 | 17.142 | 839.71 | 840.161 |
| 96.8389735961324 | 1.343 | 17.683 | 839.45 | 839.911 |
| 96.99702491632577 | 1.434 | 17.733 | 838.628 | 839.079 |
| 97.16437337300111 | 1.353 | 17.563 | 836.924 | 837.365 |
| 97.33172182967647 | 1.243 | 17.463 | 834.738 | 835.169 |
| 97.49907028635181 | 0.872 | 17.342 | 831.951 | 832.372 |
| 97.66641874302715 | 0.642 | 17.453 | 829.536 | 829.957 |
| 97.8337671997025 | 0.561 | 17.773 | 827.43 | 827.861 |
| 98.00111565637785 | 0.13 | 18.154 | 825.646 | 826.067 |
| 98.16846411305319 | -0.341 | 18.646 | 824.423 | 824.864 |
| 98.33581256972855 | -0.311 | 19.317 | 824.914 | 825.365 |
| 98.50316102640389 | -0.11 | 19.879 | 825.806 | 826.258 |
| 98.67050948307921 | -0.08 | 20.039 | 825.035 | 825.496 |
| 98.83785793975456 | -0.231 | 20.199 | 822.548 | 823.03 |
| 99.0052063964299 | -0.381 | 20.36 | 820.062 | 820.554 |
| 99.17255485310525 | -0.411 | 20.58 | 819.671 | 820.153 |
| 99.33060617329863 | -0.02 | 20.791 | 820.724 | 821.215 |
| 99.49795462997399 | 0.381 | 20.841 | 821.175 | 821.666 |
| 99.66530308664933 | 0.561 | 20.59 | 820.564 | 821.045 |
| 99.83265154332467 | 0.511 | 20.229 | 819.07 | 819.541 |
| 100.0 | 0.381 | 19.818 | 817.025 | 817.496 |